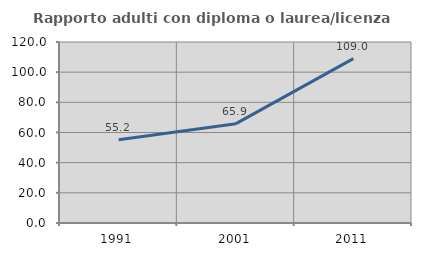
| Category | Rapporto adulti con diploma o laurea/licenza media  |
|---|---|
| 1991.0 | 55.172 |
| 2001.0 | 65.854 |
| 2011.0 | 109.009 |